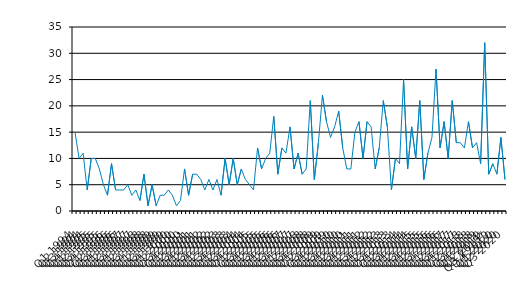
| Category | Series 0 |
|---|---|
| Q1 1994 | 15 |
| Q2 1994 | 10 |
| Q3 1994 | 11 |
| Q4 1994 | 4 |
| Q1 1995 | 10 |
| Q2 1995 | 10 |
| Q3 1995 | 8 |
| Q4 1995 | 5 |
| Q1 1996 | 3 |
| Q2 1996 | 9 |
| Q3 1996 | 4 |
| Q4 1996 | 4 |
| Q1 1997 | 4 |
| Q2 1997 | 5 |
| Q3 1997 | 3 |
| Q4 1997 | 4 |
| Q1 1998 | 2 |
| Q2 1998 | 7 |
| Q3 1998 | 1 |
| Q4 1998 | 5 |
| Q1 1999 | 1 |
| Q2 1999 | 3 |
| Q3 1999 | 3 |
| Q4 1999 | 4 |
| Q1 2000 | 3 |
| Q2 2000 | 1 |
| Q3 2000 | 2 |
| Q4 2000 | 8 |
| Q1 2001 | 3 |
| Q2 2001 | 7 |
| Q3 2001 | 7 |
| Q4 2001 | 6 |
| Q1 2002 | 4 |
| Q2 2002 | 6 |
| Q3 2002 | 4 |
| Q4 2002 | 6 |
| Q1 2003 | 3 |
| Q2 2003 | 10 |
| Q3 2003 | 5 |
| Q4 2003 | 10 |
| Q1 2004 | 5 |
| Q2 2004 | 8 |
| Q3 2004 | 6 |
| Q4 2004 | 5 |
| Q1 2005 | 4 |
| Q2 2005 | 12 |
| Q3 2005 | 8 |
| Q4 2005 | 10 |
| Q1 2006 | 11 |
| Q2 2006 | 18 |
| Q3 2006 | 7 |
| Q4 2006 | 12 |
| Q1 2007 | 11 |
| Q2 2007 | 16 |
| Q3 2007 | 8 |
| Q4 2007 | 11 |
| Q1 2008 | 7 |
| Q2 2008 | 8 |
| Q3 2008 | 21 |
| Q4 2008 | 6 |
| Q1 2009 | 13 |
| Q2 2009 | 22 |
| Q3 2009 | 17 |
| Q4 2009 | 14 |
| Q1 2010 | 16 |
| Q2 2010 | 19 |
| Q3 2010 | 12 |
| Q4 2010 | 8 |
| Q1 2011 | 8 |
| Q2 2011 | 15 |
| Q3 2011 | 17 |
| Q4 2011 | 10 |
| Q1 2012 | 17 |
| Q2 2012 | 16 |
| Q3 2012 | 8 |
| Q4 2012 | 12 |
| Q1 2013 | 21 |
| Q2 2013 | 16 |
| Q3 2013 | 4 |
| Q4 2013 | 10 |
| Q1 2014 | 9 |
| Q2 2014 | 25 |
| Q3 2014 | 8 |
| Q4 2014 | 16 |
| Q1 2015 | 10 |
| Q2 2015 | 21 |
| Q3 2015 | 6 |
| Q4 2015 | 11 |
| Q1 2016 | 14 |
| Q2 2016 | 27 |
| Q3 2016 | 12 |
| Q4 2016 | 17 |
| Q1 2017 | 10 |
| Q2 2017 | 21 |
| Q3 2017 | 13 |
| Q4 2017 | 13 |
| Q1 2018 | 12 |
| Q2 2018 | 17 |
| Q3 2018 | 12 |
| Q4 2018 | 13 |
| Q1 2019 | 9 |
| Q2 2019 | 32 |
| Q3 2019* | 7 |
| Q4 2019 | 9 |
| Q1 2020 | 7 |
| Q2 2020 | 14 |
| Q3 2020 | 6 |